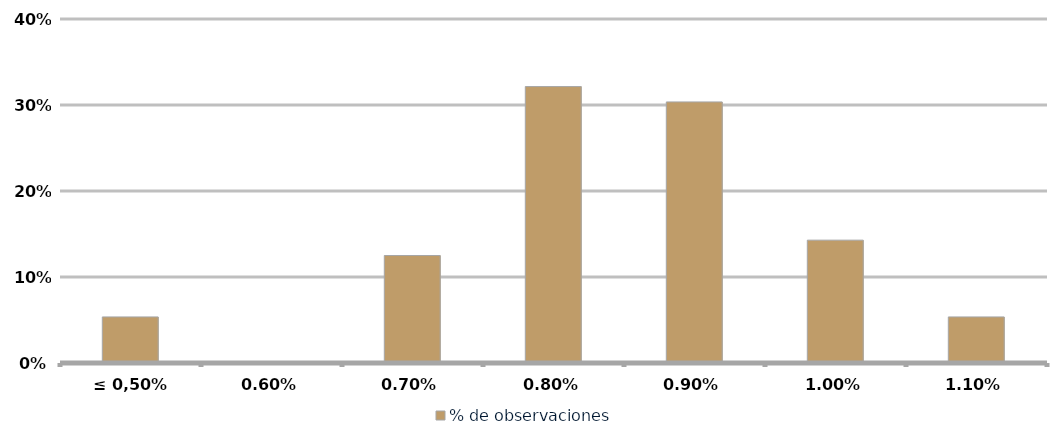
| Category | % de observaciones  |
|---|---|
| ≤ 0,50% | 0.054 |
| 0,60% | 0 |
| 0,70% | 0.125 |
| 0,80% | 0.321 |
| 0,90% | 0.304 |
| 1,00% | 0.143 |
| 1,10% | 0.054 |